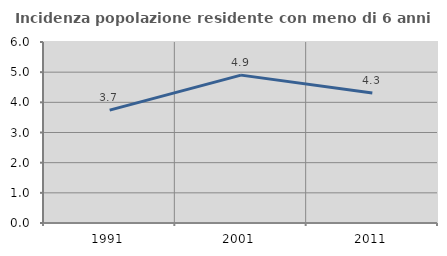
| Category | Incidenza popolazione residente con meno di 6 anni |
|---|---|
| 1991.0 | 3.742 |
| 2001.0 | 4.902 |
| 2011.0 | 4.311 |